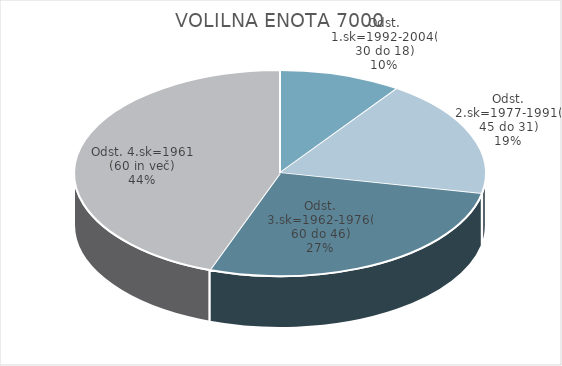
| Category | VOLILNA ENOTA 7000 |
|---|---|
| Odst. 1.sk=1992-2004(30 do 18) | 4.56 |
| Odst. 2.sk=1977-1991(45 do 31) | 8.76 |
| Odst. 3.sk=1962-1976(60 do 46) | 12.89 |
| Odst. 4.sk=1961 (60 in več) | 20.98 |